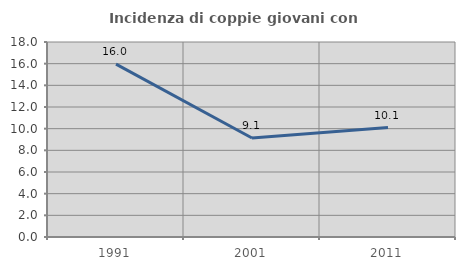
| Category | Incidenza di coppie giovani con figli |
|---|---|
| 1991.0 | 15.96 |
| 2001.0 | 9.137 |
| 2011.0 | 10.106 |